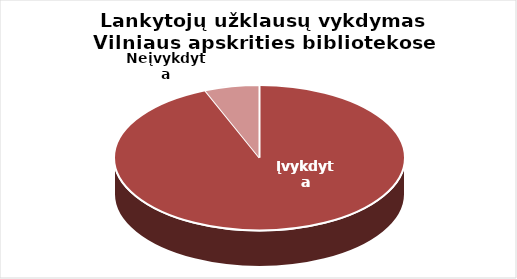
| Category | Series 0 |
|---|---|
| Įvykdyta | 322657 |
| Neįvykdyta | 20986 |